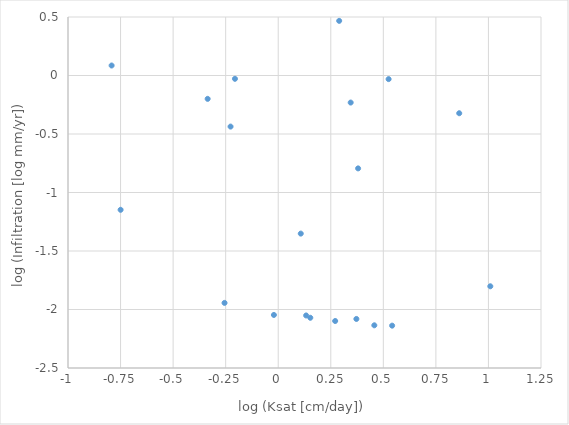
| Category | Series 0 |
|---|---|
| 0.1526051313272326 | -2.071 |
| -0.02057263663190548 | -2.047 |
| 0.45709160246858693 | -2.135 |
| -0.20581777357582132 | -0.028 |
| 0.28995955942100055 | 0.467 |
| -0.25538704660130573 | -1.944 |
| 1.0088960785191787 | -1.802 |
| 0.2709070378346628 | -2.098 |
| 0.10725660180735629 | -1.351 |
| 0.37182038917028754 | -2.081 |
| 0.5251225976988743 | -0.031 |
| 0.3447406728318048 | -0.231 |
| 0.13278275189791366 | -2.051 |
| -0.22671977570707377 | -0.437 |
| -0.749765219893263 | -1.148 |
| 0.860983434487168 | -0.323 |
| -0.33565704572394656 | -0.2 |
| 0.5418480573058544 | -2.138 |
| 0.37998085418798466 | -0.794 |
| -0.7924691886299476 | 0.085 |